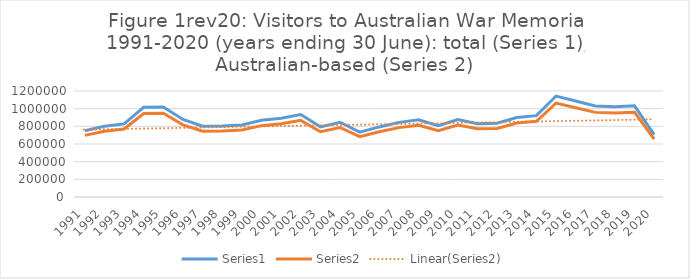
| Category | Series 0 | Series 1 |
|---|---|---|
| 1991.0 | 750000 | 697500 |
| 1992.0 | 800000 | 744000 |
| 1993.0 | 827327 | 769414 |
| 1994.0 | 1015781 | 944676 |
| 1995.0 | 1019279 | 947929 |
| 1996.0 | 877680 | 816242 |
| 1997.0 | 800790 | 744735 |
| 1998.0 | 802950 | 746743 |
| 1999.0 | 814850 | 757810 |
| 2000.0 | 868600 | 807798 |
| 2001.0 | 892017 | 829576 |
| 2002.0 | 933200 | 867876 |
| 2003.0 | 794020 | 738439 |
| 2004.0 | 845995 | 786775 |
| 2005.0 | 733975 | 682597 |
| 2006.0 | 793335 | 737802 |
| 2007.0 | 844899 | 785576 |
| 2008.0 | 873547 | 812399 |
| 2009.0 | 807066 | 750571 |
| 2010.0 | 877000 | 815610 |
| 2011.0 | 830000 | 771900 |
| 2012.0 | 835000 | 776550 |
| 2013.0 | 900500 | 837465 |
| 2014.0 | 921300 | 856809 |
| 2015.0 | 1142814 | 1062817 |
| 2016.0 | 1087000 | 1010910 |
| 2017.0 | 1030104 | 957997 |
| 2018.0 | 1021362 | 949867 |
| 2019.0 | 1031656 | 959440 |
| 2020.0 | 705692 | 656294 |